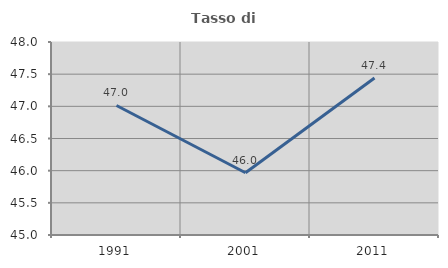
| Category | Tasso di occupazione   |
|---|---|
| 1991.0 | 47.013 |
| 2001.0 | 45.968 |
| 2011.0 | 47.44 |